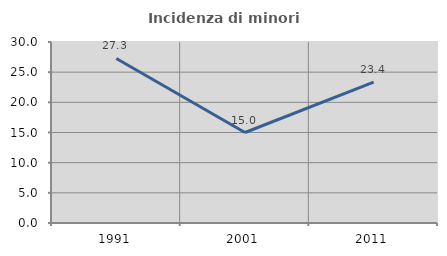
| Category | Incidenza di minori stranieri |
|---|---|
| 1991.0 | 27.273 |
| 2001.0 | 15 |
| 2011.0 | 23.364 |